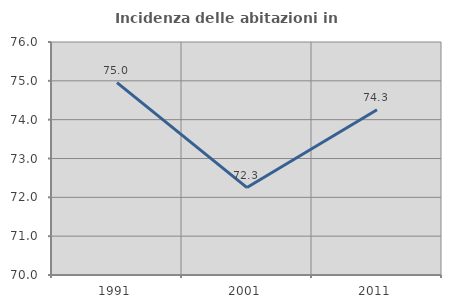
| Category | Incidenza delle abitazioni in proprietà  |
|---|---|
| 1991.0 | 74.956 |
| 2001.0 | 72.251 |
| 2011.0 | 74.256 |